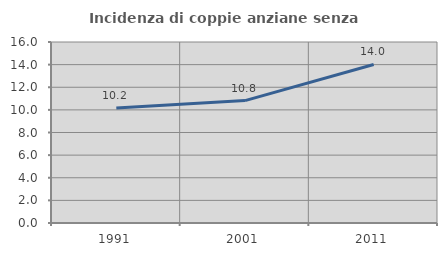
| Category | Incidenza di coppie anziane senza figli  |
|---|---|
| 1991.0 | 10.159 |
| 2001.0 | 10.819 |
| 2011.0 | 14.016 |